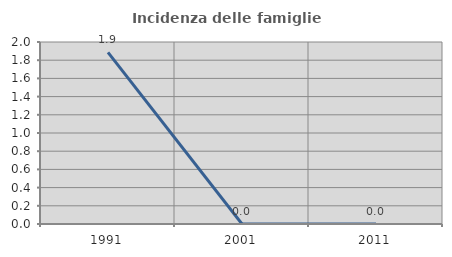
| Category | Incidenza delle famiglie numerose |
|---|---|
| 1991.0 | 1.887 |
| 2001.0 | 0 |
| 2011.0 | 0 |